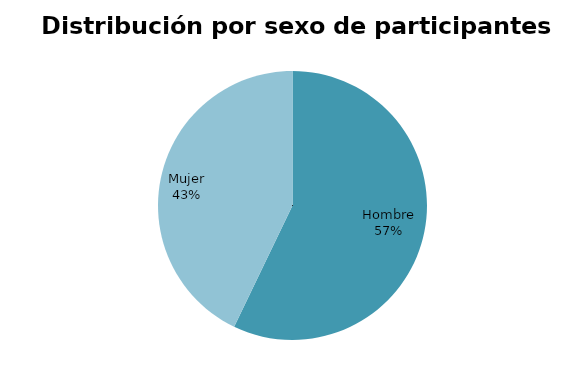
| Category | Series 0 |
|---|---|
| Hombre | 4 |
| Mujer | 3 |